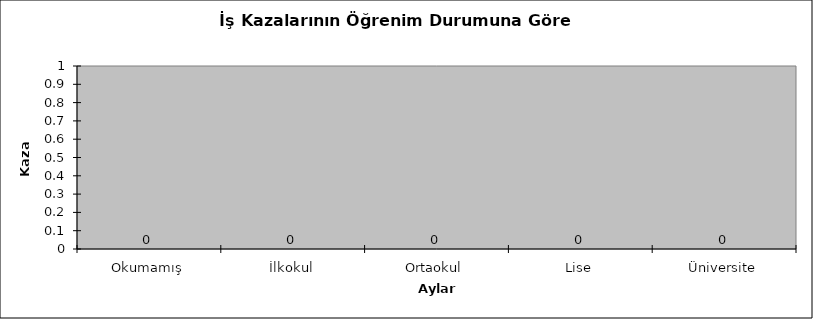
| Category | Series 1 |
|---|---|
| Okumamış | 0 |
| İlkokul | 0 |
| Ortaokul | 0 |
| Lise | 0 |
| Üniversite | 0 |